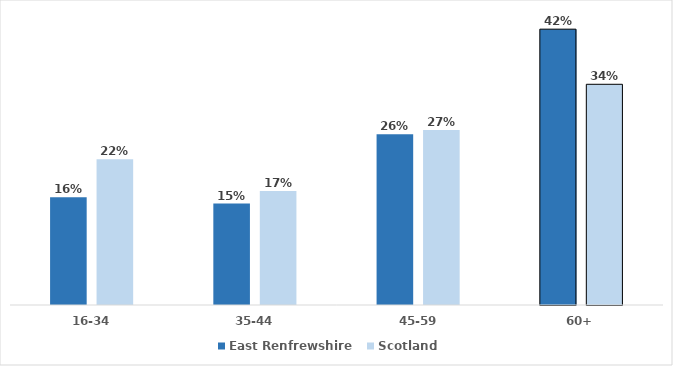
| Category | East Renfrewshire | Scotland |
|---|---|---|
| 16-34 | 0.164 | 0.222 |
| 35-44 | 0.155 | 0.174 |
| 45-59 | 0.26 | 0.267 |
| 60+ | 0.421 | 0.337 |